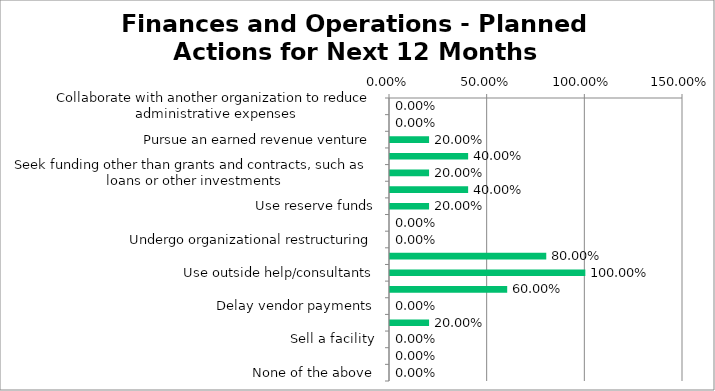
| Category | Responses |
|---|---|
| Collaborate with another organization to reduce administrative expenses | 0 |
| Merge with another organization | 0 |
| Pursue an earned revenue venture | 0.2 |
| Advocate to government on behalf of your organization's cause | 0.4 |
| Seek funding other than grants and contracts, such as loans or other investments | 0.2 |
| Add to reserve funds | 0.4 |
| Use reserve funds | 0.2 |
| Launch a capital campaign | 0 |
| Undergo organizational restructuring | 0 |
| Conduct long-term strategic or financial planning | 0.8 |
| Use outside help/consultants | 1 |
| Upgrade hardware or software to improve organizational efficiency | 0.6 |
| Delay vendor payments | 0 |
| Purchase or lease a facility | 0.2 |
| Sell a facility | 0 |
| Renovate a facility that you lease or own | 0 |
| None of the above | 0 |